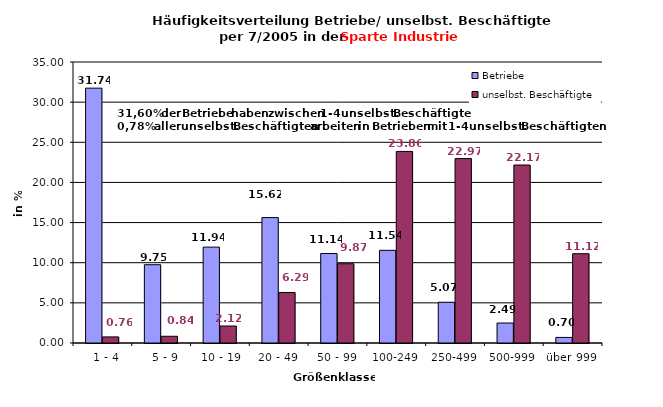
| Category | Betriebe | unselbst. Beschäftigte |
|---|---|---|
|   1 - 4 | 31.741 | 0.759 |
|   5 - 9 | 9.751 | 0.839 |
|  10 - 19 | 11.94 | 2.117 |
| 20 - 49 | 15.622 | 6.292 |
| 50 - 99 | 11.144 | 9.872 |
| 100-249 | 11.542 | 23.859 |
| 250-499 | 5.075 | 22.969 |
| 500-999 | 2.488 | 22.171 |
| über 999 | 0.697 | 11.123 |